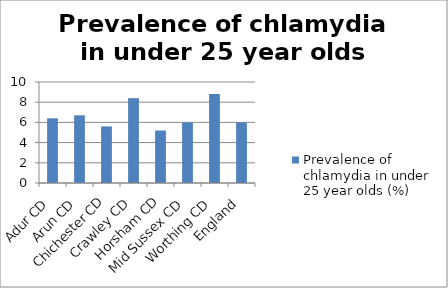
| Category | Prevalence of chlamydia in under 25 year olds (%) |
|---|---|
| Adur CD | 6.4 |
| Arun CD | 6.7 |
| Chichester CD | 5.6 |
| Crawley CD | 8.4 |
| Horsham CD | 5.2 |
| Mid Sussex CD | 6 |
| Worthing CD | 8.8 |
| England | 6 |